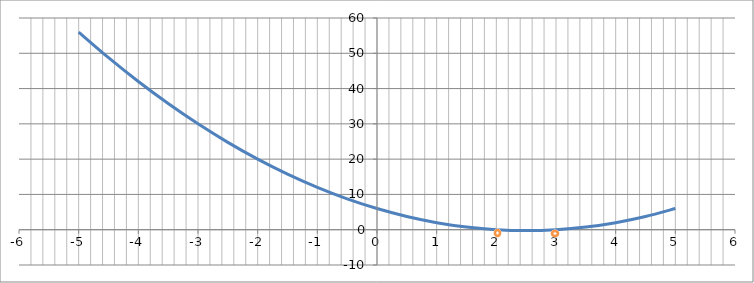
| Category | Series 0 |
|---|---|
| 5.0 | 6 |
| 4.5 | 3.75 |
| 4.0 | 2 |
| 3.5 | 0.75 |
| 3.0 | 0 |
| 2.5 | -0.25 |
| 2.0 | 0 |
| 1.5 | 0.75 |
| 1.0 | 2 |
| 0.5 | 3.75 |
| 0.0 | 6 |
| -0.5 | 8.75 |
| -1.0 | 12 |
| -1.5 | 15.75 |
| -2.0 | 20 |
| -2.5 | 24.75 |
| -3.0 | 30 |
| -3.5 | 35.75 |
| -4.0 | 42 |
| -4.5 | 48.75 |
| -5.0 | 56 |